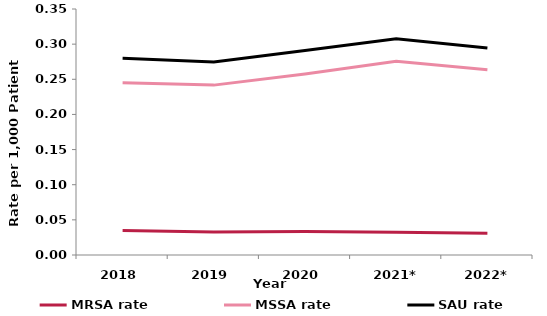
| Category | MRSA rate | MSSA rate | SAU rate |
|---|---|---|---|
| 2018 | 0.035 | 0.245 | 0.28 |
| 2019 | 0.033 | 0.242 | 0.275 |
| 2020 | 0.033 | 0.257 | 0.291 |
| 2021* | 0.032 | 0.276 | 0.308 |
| 2022* | 0.031 | 0.264 | 0.295 |